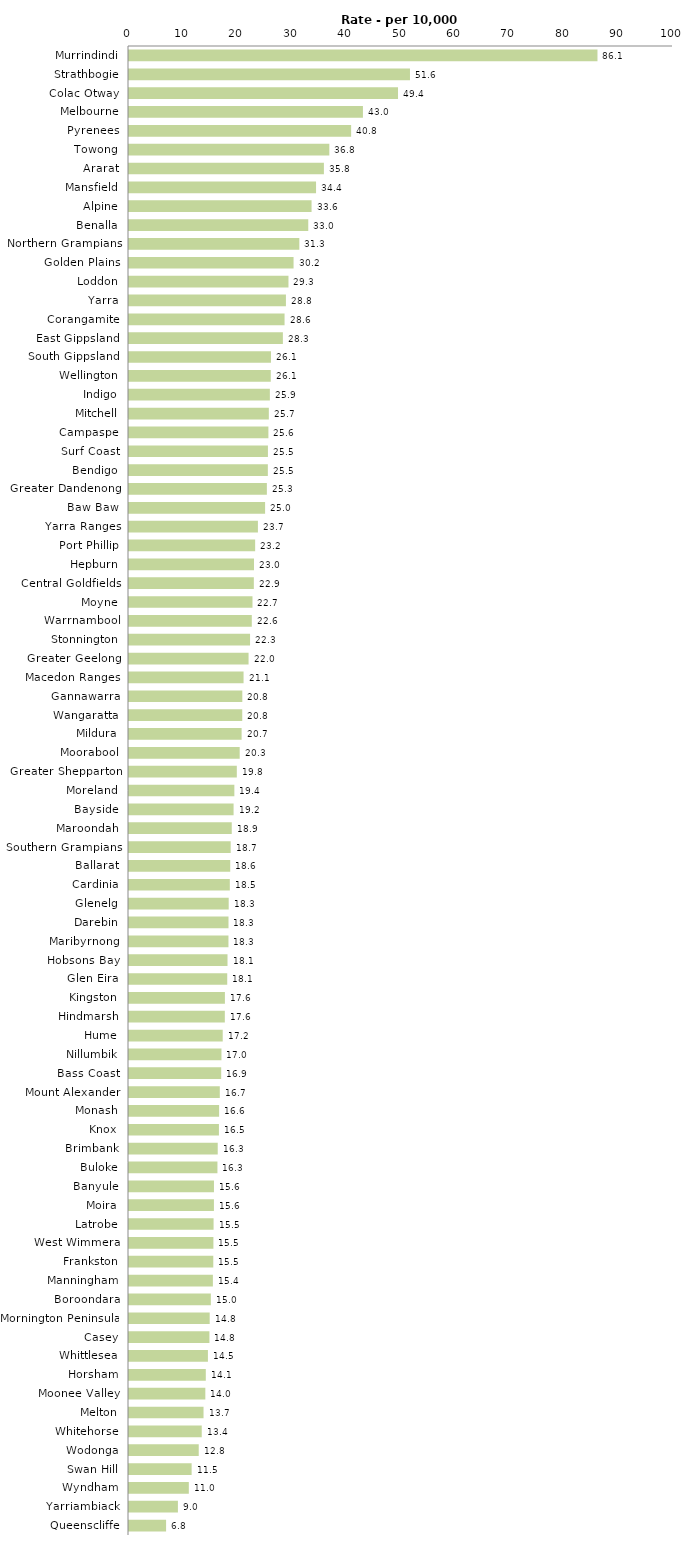
| Category | Series 0 |
|---|---|
| Murrindindi | 86.116 |
| Strathbogie | 51.65 |
| Colac Otway | 49.45 |
| Melbourne | 43.002 |
| Pyrenees | 40.833 |
| Towong | 36.826 |
| Ararat | 35.827 |
| Mansfield | 34.384 |
| Alpine | 33.56 |
| Benalla | 32.951 |
| Northern Grampians | 31.31 |
| Golden Plains | 30.249 |
| Loddon | 29.314 |
| Yarra | 28.848 |
| Corangamite | 28.596 |
| East Gippsland | 28.285 |
| South Gippsland | 26.095 |
| Wellington | 26.059 |
| Indigo | 25.894 |
| Mitchell | 25.704 |
| Campaspe | 25.625 |
| Surf Coast | 25.54 |
| Bendigo | 25.524 |
| Greater Dandenong | 25.343 |
| Baw Baw | 25.018 |
| Yarra Ranges | 23.697 |
| Port Phillip | 23.189 |
| Hepburn | 22.977 |
| Central Goldfields | 22.948 |
| Moyne | 22.699 |
| Warrnambool | 22.573 |
| Stonnington | 22.254 |
| Greater Geelong | 21.977 |
| Macedon Ranges | 21.058 |
| Gannawarra | 20.827 |
| Wangaratta | 20.816 |
| Mildura | 20.701 |
| Moorabool | 20.348 |
| Greater Shepparton | 19.819 |
| Moreland | 19.367 |
| Bayside | 19.225 |
| Maroondah | 18.886 |
| Southern Grampians | 18.69 |
| Ballarat | 18.609 |
| Cardinia | 18.534 |
| Glenelg | 18.326 |
| Darebin | 18.29 |
| Maribyrnong | 18.282 |
| Hobsons Bay | 18.108 |
| Glen Eira | 18.056 |
| Kingston | 17.63 |
| Hindmarsh | 17.615 |
| Hume | 17.228 |
| Nillumbik | 16.996 |
| Bass Coast | 16.948 |
| Mount Alexander | 16.692 |
| Monash | 16.566 |
| Knox | 16.531 |
| Brimbank | 16.311 |
| Buloke | 16.258 |
| Banyule | 15.618 |
| Moira | 15.612 |
| Latrobe | 15.547 |
| West Wimmera | 15.516 |
| Frankston | 15.493 |
| Manningham | 15.42 |
| Boroondara | 15.046 |
| Mornington Peninsula | 14.833 |
| Casey | 14.784 |
| Whittlesea | 14.508 |
| Horsham | 14.118 |
| Moonee Valley | 14.032 |
| Melton | 13.701 |
| Whitehorse | 13.371 |
| Wodonga | 12.819 |
| Swan Hill | 11.511 |
| Wyndham | 10.996 |
| Yarriambiack | 8.991 |
| Queenscliffe | 6.817 |